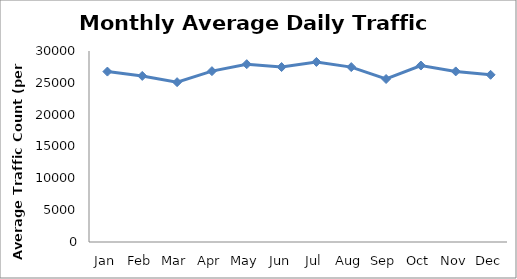
| Category | Series 0 |
|---|---|
| Jan | 26766.75 |
| Feb | 26084 |
| Mar | 25104 |
| Apr | 26836.25 |
| May | 27928.75 |
| Jun | 27482 |
| Jul | 28280.5 |
| Aug | 27472.75 |
| Sep | 25602 |
| Oct | 27717.5 |
| Nov | 26792.75 |
| Dec | 26261.25 |